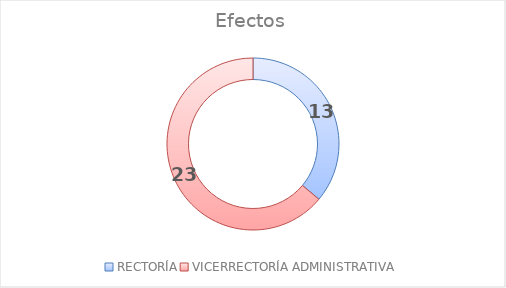
| Category | Efectos |
|---|---|
| RECTORÍA | 13 |
| VICERRECTORÍA ADMINISTRATIVA | 23 |